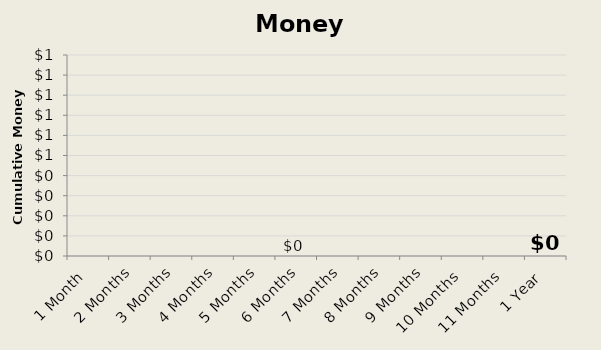
| Category | Money Saved |
|---|---|
| 1 Month | 0 |
| 2 Months | 0 |
| 3 Months | 0 |
| 4 Months | 0 |
| 5 Months | 0 |
| 6 Months | 0 |
| 7 Months | 0 |
| 8 Months | 0 |
| 9 Months | 0 |
| 10 Months | 0 |
| 11 Months | 0 |
| 1 Year | 0 |